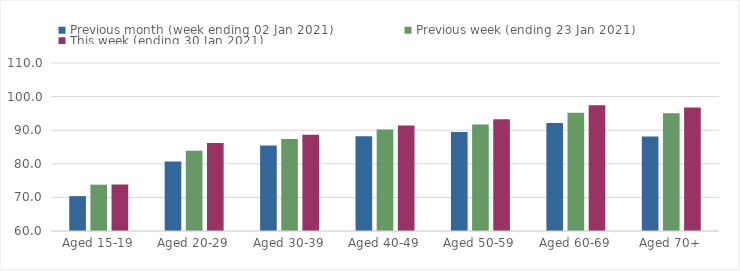
| Category | Previous month (week ending 02 Jan 2021) | Previous week (ending 23 Jan 2021) | This week (ending 30 Jan 2021) |
|---|---|---|---|
| Aged 15-19 | 70.38 | 73.79 | 73.84 |
| Aged 20-29 | 80.72 | 83.89 | 86.16 |
| Aged 30-39 | 85.41 | 87.4 | 88.67 |
| Aged 40-49 | 88.19 | 90.2 | 91.4 |
| Aged 50-59 | 89.43 | 91.73 | 93.26 |
| Aged 60-69 | 92.18 | 95.2 | 97.41 |
| Aged 70+ | 88.12 | 95.08 | 96.76 |